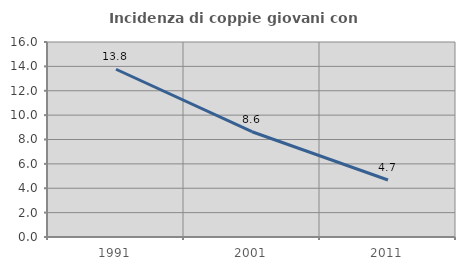
| Category | Incidenza di coppie giovani con figli |
|---|---|
| 1991.0 | 13.764 |
| 2001.0 | 8.639 |
| 2011.0 | 4.675 |